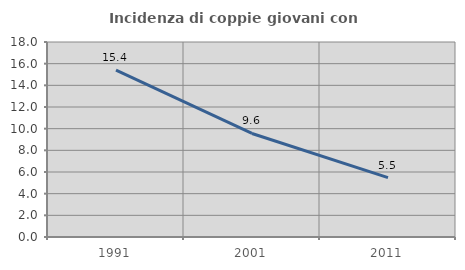
| Category | Incidenza di coppie giovani con figli |
|---|---|
| 1991.0 | 15.41 |
| 2001.0 | 9.557 |
| 2011.0 | 5.481 |